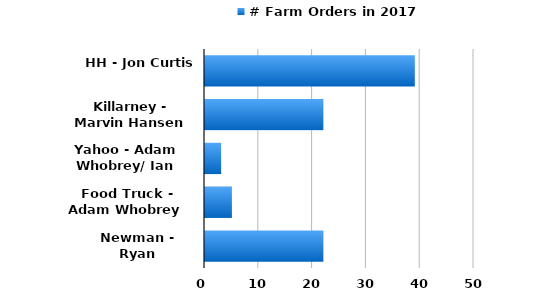
| Category | # Farm Orders in 2017 |
|---|---|
| HH - Jon Curtis  | 39 |
| Killarney - Marvin Hansen  | 22 |
| Yahoo - Adam Whobrey/ Ian Rose  | 3 |
| Food Truck - Adam Whobrey  | 5 |
| Newman - Ryan Pecchenino  | 22 |